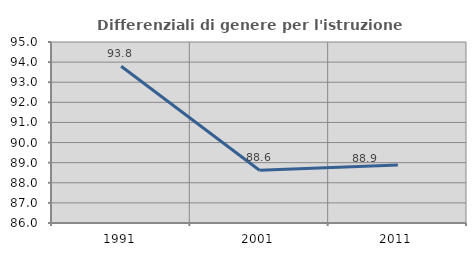
| Category | Differenziali di genere per l'istruzione superiore |
|---|---|
| 1991.0 | 93.798 |
| 2001.0 | 88.623 |
| 2011.0 | 88.881 |